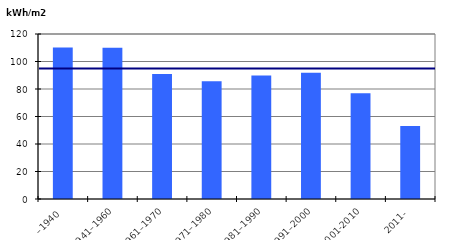
| Category | Byggårskategori |
|---|---|
| –1940 | 110.208 |
| 1941–1960 | 110.002 |
| 1961–1970 | 90.845 |
| 1971–1980 | 85.58 |
| 1981–1990 | 89.897 |
| 1991–2000 | 91.897 |
| 2001-2010 | 76.856 |
| 2011- | 53.17 |